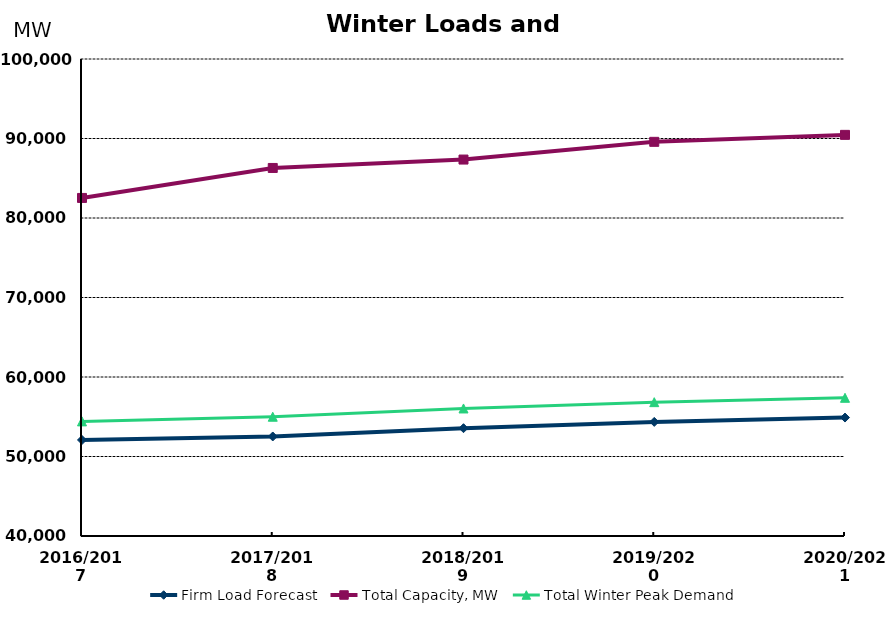
| Category | Firm Load Forecast | Total Capacity, MW | Total Winter Peak Demand |
|---|---|---|---|
| 2016/2017 | 52078.953 | 82523.37 | 54417.089 |
| 2017/2018 | 52519.364 | 86293.51 | 55003.088 |
| 2018/2019 | 53559.751 | 87350.935 | 56043.475 |
| 2019/2020 | 54352.414 | 89580.335 | 56836.139 |
| 2020/2021 | 54898.975 | 90456.935 | 57382.7 |